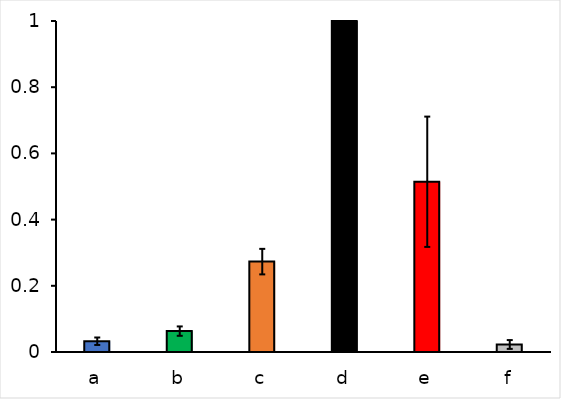
| Category | Series 0 |
|---|---|
| a | 0.033 |
| b | 0.063 |
| c | 0.273 |
| d | 1 |
| e | 0.514 |
| f | 0.023 |